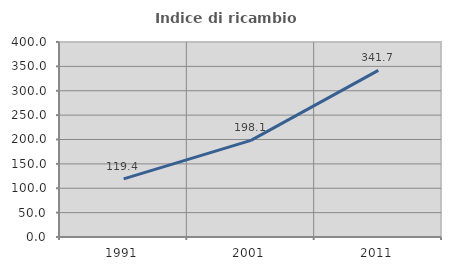
| Category | Indice di ricambio occupazionale  |
|---|---|
| 1991.0 | 119.355 |
| 2001.0 | 198.113 |
| 2011.0 | 341.667 |